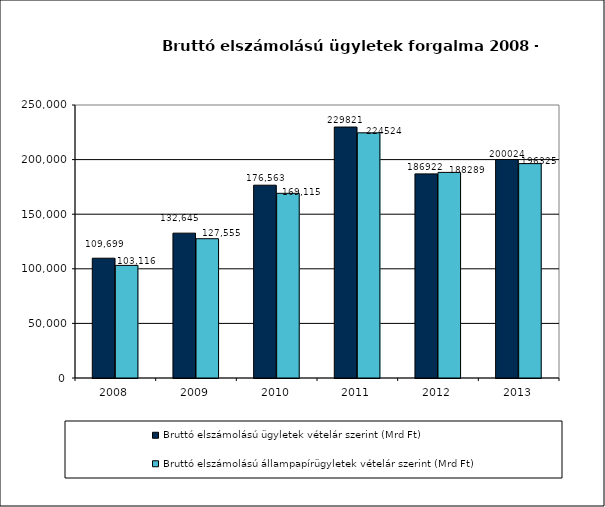
| Category | Bruttó elszámolású ügyletek vételár szerint (Mrd Ft) | Bruttó elszámolású állampapírügyletek vételár szerint (Mrd Ft) |
|---|---|---|
| 2008.0 | 109699 | 103116 |
| 2009.0 | 132645 | 127555 |
| 2010.0 | 176563 | 169115 |
| 2011.0 | 229821 | 224524 |
| 2012.0 | 186922 | 188289 |
| 2013.0 | 200024 | 196325 |